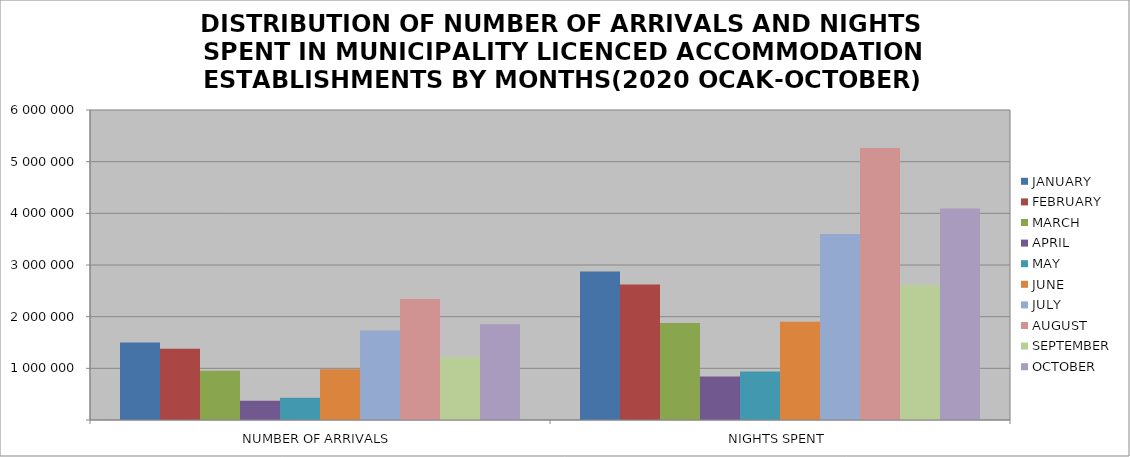
| Category | JANUARY | FEBRUARY | MARCH | APRIL | MAY | JUNE | JULY | AUGUST | SEPTEMBER | OCTOBER |
|---|---|---|---|---|---|---|---|---|---|---|
| NUMBER OF ARRIVALS | 1497815 | 1380765 | 955554 | 372466 | 430328 | 981538 | 1730606 | 2342031 | 1217037 | 1851250 |
| NIGHTS SPENT | 2872303 | 2621819 | 1878971 | 839735 | 939652 | 1902057 | 3601580 | 5263679 | 2612279 | 4093869 |